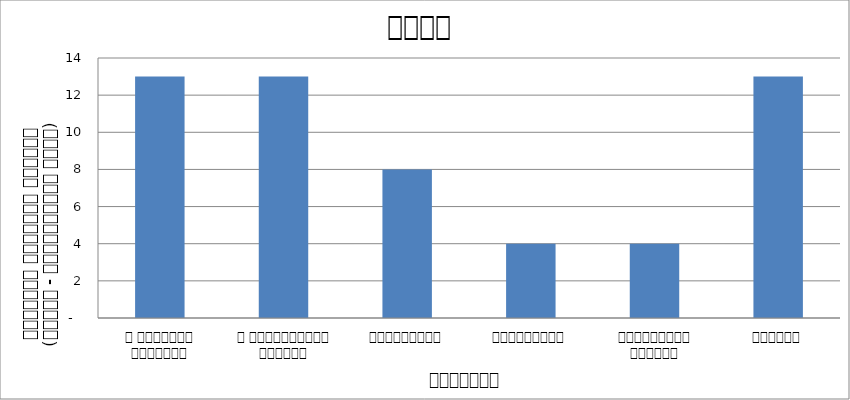
| Category | शासन |
|---|---|
| द हिमालयन टाइम्स् | 13 |
| द काठमाण्डौं पोस्ट् | 13 |
| रिपब्लिका | 8 |
| कान्तिपुर | 4 |
| अन्नपूर्ण पोस्ट् | 4 |
| नागरिक | 13 |